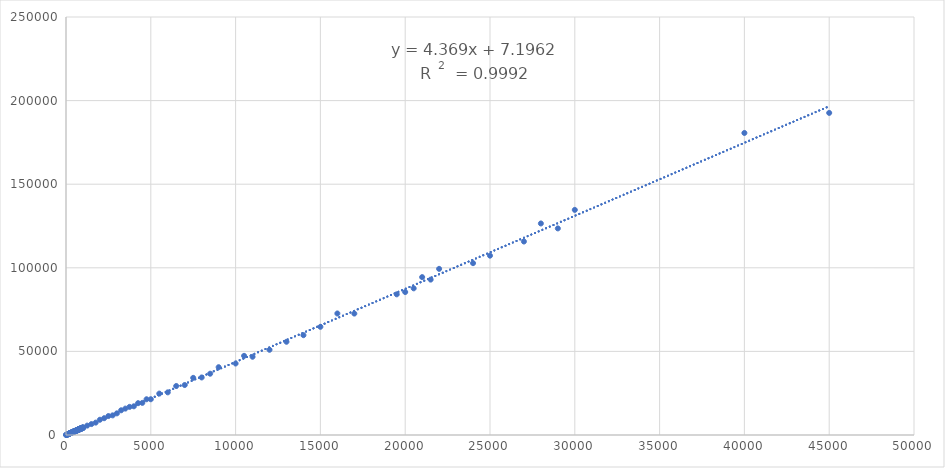
| Category | Ereignisse(3) |
|---|---|
| 45000.0 | 192636.505 |
| 40000.0 | 180637.689 |
| 30000.0 | 134636.892 |
| 29000.0 | 123561.168 |
| 28000.0 | 126517.692 |
| 27000.0 | 115724.269 |
| 25000.0 | 107264.748 |
| 24000.0 | 102775.115 |
| 22000.0 | 99366.549 |
| 21500.0 | 92940.251 |
| 21000.0 | 94422.287 |
| 20500.0 | 87721.666 |
| 20000.0 | 85497.657 |
| 19500.0 | 84132.448 |
| 17000.0 | 72621.015 |
| 16000.0 | 72679.4 |
| 15000.0 | 64702.523 |
| 14000.0 | 59698.524 |
| 13000.0 | 55766.867 |
| 12000.0 | 50965.21 |
| 11000.0 | 46792.282 |
| 10500.0 | 47338.153 |
| 10000.0 | 42756.742 |
| 9000.0 | 40547.976 |
| 8500.0 | 36657.947 |
| 8000.0 | 34417.362 |
| 7500.0 | 34173.713 |
| 7000.0 | 29889.847 |
| 6500.0 | 29304.373 |
| 6000.0 | 25503.895 |
| 5500.0 | 24762.881 |
| 5000.0 | 21389.603 |
| 4750.0 | 21371.82 |
| 4500.0 | 19209.438 |
| 4250.0 | 19030.584 |
| 4000.0 | 17165.756 |
| 3750.0 | 16824.248 |
| 3500.0 | 15789.348 |
| 3250.0 | 14770.683 |
| 3000.0 | 12942.954 |
| 2750.0 | 11738.387 |
| 2500.0 | 11340.572 |
| 2250.0 | 10040.99 |
| 2000.0 | 9123.071 |
| 1750.0 | 7406.075 |
| 1500.0 | 6536.651 |
| 1250.0 | 5617.292 |
| 1000.0 | 4221.829 |
| 999.0 | 4332.185 |
| 998.0 | 4290.385 |
| 997.0 | 4188.456 |
| 996.0 | 4351.889 |
| 995.0 | 4212.726 |
| 994.0 | 4345.587 |
| 993.0 | 4309.11 |
| 992.0 | 4419.945 |
| 986.0 | 4434.358 |
| 969.0 | 4342.409 |
| 963.0 | 4115.111 |
| 958.0 | 4211.204 |
| 953.0 | 4312.506 |
| 948.0 | 4080.472 |
| 943.0 | 4082.194 |
| 938.0 | 4292.029 |
| 932.0 | 4090.211 |
| 927.0 | 3982.639 |
| 922.0 | 4153.244 |
| 917.0 | 4040.283 |
| 912.0 | 4094.263 |
| 906.0 | 3857.822 |
| 901.0 | 3963.083 |
| 896.0 | 3845.874 |
| 891.0 | 4094.765 |
| 886.0 | 3697.021 |
| 881.0 | 3575.607 |
| 875.0 | 3792.326 |
| 870.0 | 3933.382 |
| 865.0 | 3967.032 |
| 860.0 | 4003.991 |
| 855.0 | 3752.417 |
| 849.0 | 3709.289 |
| 844.0 | 3854.738 |
| 839.0 | 3621.273 |
| 834.0 | 3514.306 |
| 829.0 | 3476.009 |
| 824.0 | 3481.982 |
| 818.0 | 3637.499 |
| 813.0 | 3596.286 |
| 808.0 | 3559.576 |
| 803.0 | 3598.125 |
| 798.0 | 3334.171 |
| 792.0 | 3510.689 |
| 787.0 | 3462.92 |
| 782.0 | 3611.418 |
| 777.0 | 3296.465 |
| 772.0 | 3577 |
| 767.0 | 3373.488 |
| 761.0 | 3278.52 |
| 756.0 | 3509.369 |
| 751.0 | 3446.398 |
| 746.0 | 3258.115 |
| 741.0 | 3151.045 |
| 736.0 | 3192.884 |
| 730.0 | 3326.659 |
| 725.0 | 3390.698 |
| 720.0 | 3042.504 |
| 715.0 | 3027.18 |
| 710.0 | 3250.831 |
| 704.0 | 3049.202 |
| 699.0 | 3020.732 |
| 694.0 | 3147.285 |
| 689.0 | 2875.941 |
| 684.0 | 2923.125 |
| 679.0 | 3106.666 |
| 673.0 | 3060.578 |
| 668.0 | 2838.473 |
| 663.0 | 2686.081 |
| 658.0 | 2920.447 |
| 653.0 | 2962.364 |
| 647.0 | 2844.071 |
| 642.0 | 2929.544 |
| 637.0 | 2770.309 |
| 632.0 | 2698 |
| 627.0 | 2707.843 |
| 622.0 | 2747.042 |
| 616.0 | 2693.742 |
| 611.0 | 2810.773 |
| 606.0 | 2647.7 |
| 601.0 | 2735.496 |
| 596.0 | 2528.063 |
| 590.0 | 2626.717 |
| 585.0 | 2607.842 |
| 580.0 | 2479.818 |
| 575.0 | 2486.149 |
| 570.0 | 2570.277 |
| 565.0 | 2522.194 |
| 559.0 | 2518.144 |
| 554.0 | 2531.455 |
| 549.0 | 2402.317 |
| 544.0 | 2438.384 |
| 539.0 | 2400.566 |
| 534.0 | 2403.539 |
| 528.0 | 2255.659 |
| 523.0 | 2248.995 |
| 518.0 | 2400.942 |
| 513.0 | 2194.036 |
| 508.0 | 2186.521 |
| 502.0 | 2145.662 |
| 497.0 | 2155.471 |
| 492.0 | 2196.766 |
| 487.0 | 2120.531 |
| 482.0 | 2056.12 |
| 477.0 | 2218.839 |
| 471.0 | 2142.131 |
| 466.0 | 2089.07 |
| 461.0 | 2072.658 |
| 456.0 | 2141.398 |
| 451.0 | 2065.376 |
| 445.0 | 1938.842 |
| 440.0 | 1897.597 |
| 435.0 | 1985.574 |
| 430.0 | 1847.028 |
| 425.0 | 1845.211 |
| 420.0 | 1898.241 |
| 414.0 | 1696.402 |
| 409.0 | 1878.268 |
| 404.0 | 1738.237 |
| 399.0 | 1789.055 |
| 394.0 | 1708.141 |
| 388.0 | 1695.842 |
| 383.0 | 1641.591 |
| 378.0 | 1585.622 |
| 373.0 | 1664.828 |
| 368.0 | 1546.173 |
| 363.0 | 1549.863 |
| 357.0 | 1507.941 |
| 352.0 | 1622.642 |
| 347.0 | 1467.357 |
| 342.0 | 1431.827 |
| 337.0 | 1439.006 |
| 332.0 | 1456.608 |
| 326.0 | 1391.795 |
| 321.0 | 1374.959 |
| 316.0 | 1374.507 |
| 311.0 | 1385.749 |
| 306.0 | 1412.74 |
| 300.0 | 1245.644 |
| 295.0 | 1245.966 |
| 290.0 | 1337.754 |
| 285.0 | 1213.551 |
| 280.0 | 1165.852 |
| 275.0 | 1243.971 |
| 269.0 | 1205.391 |
| 264.0 | 1160.935 |
| 259.0 | 1090.808 |
| 254.0 | 1182.11 |
| 249.0 | 1183.241 |
| 243.0 | 1069.961 |
| 238.0 | 997.432 |
| 233.0 | 995.138 |
| 228.0 | 1020.148 |
| 223.0 | 996.461 |
| 218.0 | 988.611 |
| 212.0 | 945.983 |
| 207.0 | 933.704 |
| 202.0 | 913.677 |
| 197.0 | 819.441 |
| 192.0 | 774.947 |
| 186.0 | 810.492 |
| 181.0 | 764.296 |
| 176.0 | 782.488 |
| 171.0 | 732.979 |
| 166.0 | 786.201 |
| 161.0 | 729.102 |
| 155.0 | 669.537 |
| 150.0 | 650.435 |
| 145.0 | 657.494 |
| 140.0 | 602.506 |
| 135.0 | 570.498 |
| 129.0 | 525.256 |
| 124.0 | 557.282 |
| 119.0 | 517.104 |
| 114.0 | 468.163 |
| 109.0 | 488.202 |
| 104.0 | 423.001 |
| 98.0 | 448.676 |
| 93.0 | 383.817 |
| 88.0 | 362.548 |
| 83.0 | 388.394 |
| 78.0 | 333.256 |
| 73.0 | 303.074 |
| 67.0 | 306.397 |
| 62.0 | 263.079 |
| 57.0 | 271.311 |
| 52.0 | 233.634 |
| 47.0 | 210.955 |
| 41.0 | 165.907 |
| 36.0 | 145.931 |
| 31.0 | 146.471 |
| 26.0 | 97.737 |
| 21.0 | 97.579 |
| 16.0 | 58.578 |
| 10.0 | 44.446 |
| 6.0 | 21.978 |